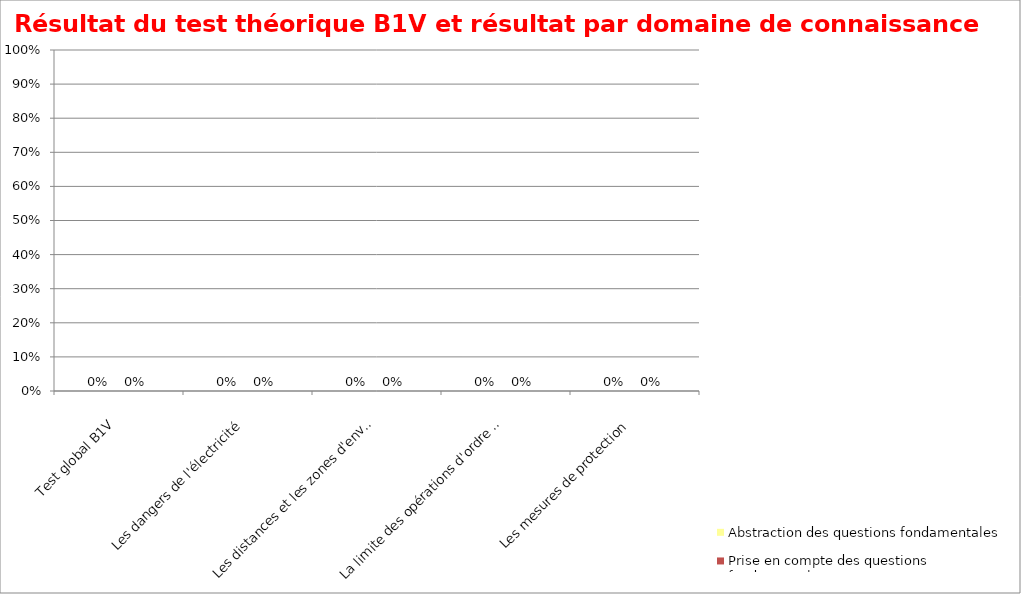
| Category | Abstraction des questions fondamentales | Prise en compte des questions fondamentales |
|---|---|---|
| Test global B1V | 0 | 0 |
| Les dangers de l'électricité | 0 | 0 |
| Les distances et les zones d'environnement | 0 | 0 |
| La limite des opérations d'ordre électrique | 0 | 0 |
| Les mesures de protection | 0 | 0 |